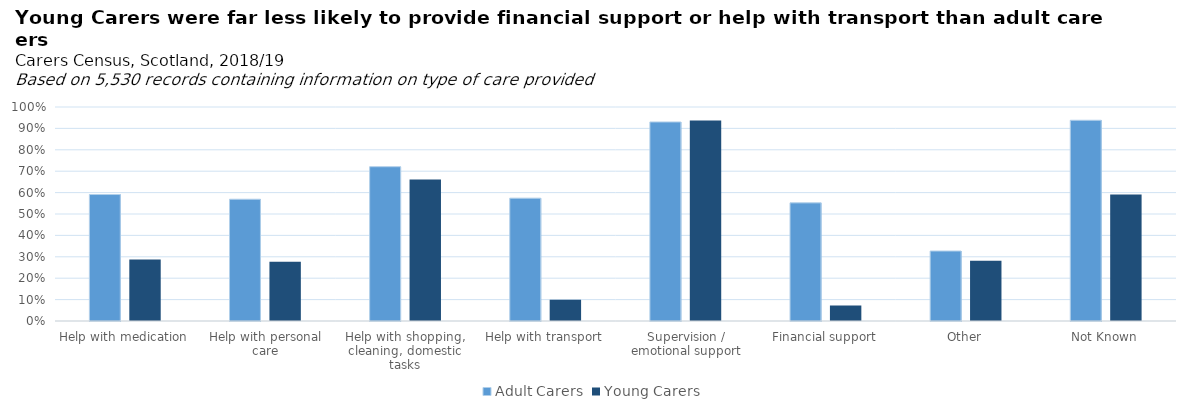
| Category | Adult Carers | Young Carers |
|---|---|---|
| Help with medication | 0.591 | 0.287 |
| Help with personal care | 0.569 | 0.277 |
| Help with shopping, cleaning, domestic tasks | 0.721 | 0.661 |
| Help with transport | 0.574 | 0.099 |
| Supervision / emotional support | 0.93 | 0.937 |
| Financial support | 0.552 | 0.073 |
| Other | 0.327 | 0.282 |
| Not Known | 0.938 | 0.591 |